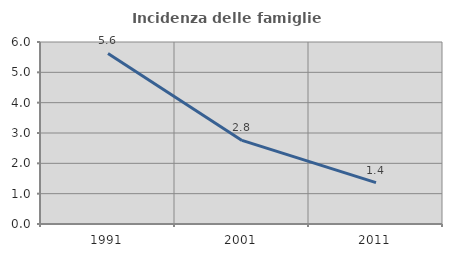
| Category | Incidenza delle famiglie numerose |
|---|---|
| 1991.0 | 5.624 |
| 2001.0 | 2.755 |
| 2011.0 | 1.365 |